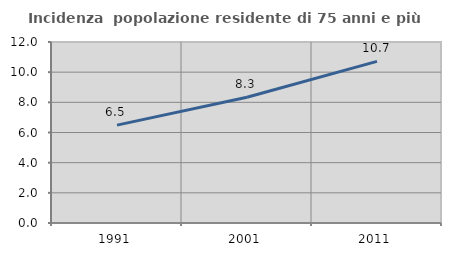
| Category | Incidenza  popolazione residente di 75 anni e più |
|---|---|
| 1991.0 | 6.487 |
| 2001.0 | 8.333 |
| 2011.0 | 10.717 |